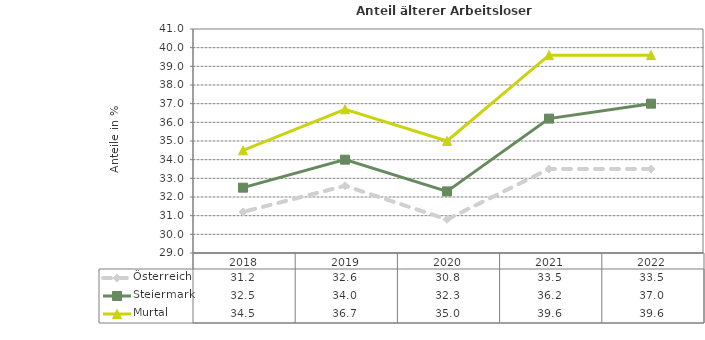
| Category | Österreich | Steiermark | Murtal |
|---|---|---|---|
| 2022.0 | 33.5 | 37 | 39.6 |
| 2021.0 | 33.5 | 36.2 | 39.6 |
| 2020.0 | 30.8 | 32.3 | 35 |
| 2019.0 | 32.6 | 34 | 36.7 |
| 2018.0 | 31.2 | 32.5 | 34.5 |